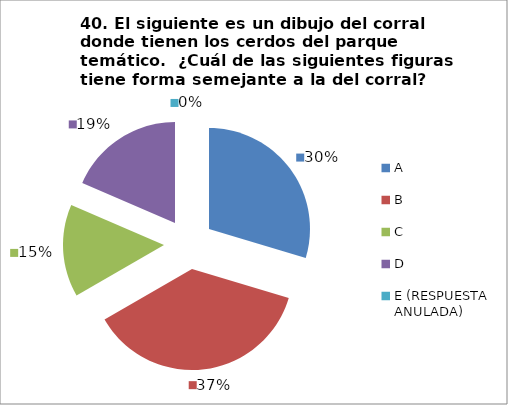
| Category | CANTIDAD DE RESPUESTAS PREGUNTA (40) | PORCENTAJE |
|---|---|---|
| A | 8 | 0.296 |
| B | 10 | 0.37 |
| C | 4 | 0.148 |
| D | 5 | 0.185 |
| E (RESPUESTA ANULADA) | 0 | 0 |